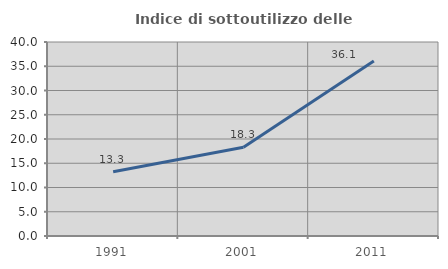
| Category | Indice di sottoutilizzo delle abitazioni  |
|---|---|
| 1991.0 | 13.267 |
| 2001.0 | 18.293 |
| 2011.0 | 36.073 |